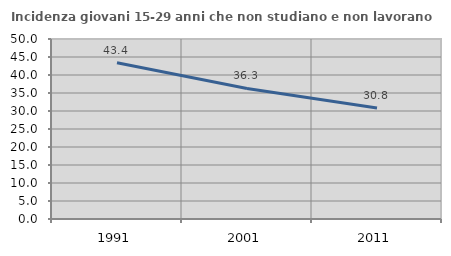
| Category | Incidenza giovani 15-29 anni che non studiano e non lavorano  |
|---|---|
| 1991.0 | 43.392 |
| 2001.0 | 36.265 |
| 2011.0 | 30.84 |